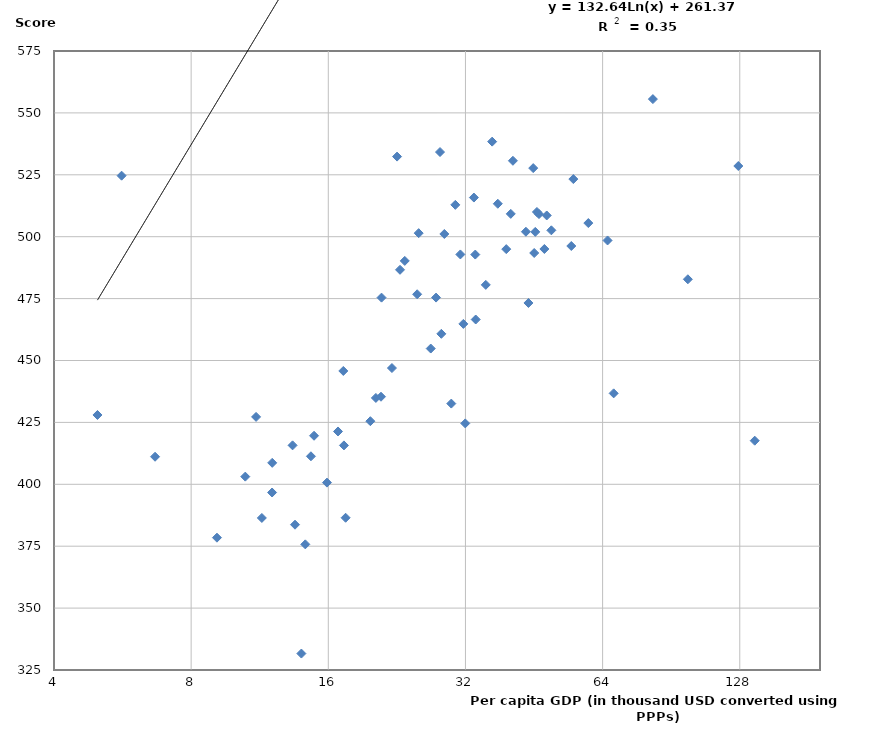
| Category | National income GPD (in thousand) |
|---|---|
| 11.10796812880865 | 427.225 |
| 14.244080743935179 | 375.745 |
| 45.92549380167015 | 509.994 |
| 47.68229980374548 | 495.037 |
| 43.43471783487115 | 502 |
| 15.8931514693368 | 400.682 |
| nan | 517.779 |
| 17.259915997248008 | 445.772 |
| nan | 475.187 |
| 45.06569154395947 | 527.705 |
| 22.07109746910648 | 446.956 |
| 22.648 | 532.347 |
| 13.35714967170521 | 415.729 |
| 14.88538947495448 | 419.608 |
| 20.93936484743499 | 475.391 |
| 29.78987192002501 | 432.596 |
| 31.18587870152681 | 492.83 |
| 45.53650585097124 | 501.937 |
| 13.964048738706149 | 331.639 |
| 28.139939440636297 | 534.194 |
| 40.6759090166703 | 530.661 |
| 39.32786767590581 | 494.978 |
| 13.5229718015613 | 383.682 |
| 6.665937217451917 | 411.132 |
| 46.40061923741901 | 509.141 |
| 26.85089388005397 | 454.829 |
| 55.19549798219206 | 523.277 |
| 25.06885185958057 | 476.748 |
| 43.99329286385754 | 473.23 |
| 10.51703284725085 | 403.1 |
| 49.39323215694124 | 502.575 |
| 33.70342504152565 | 466.553 |
| 35.46279572003777 | 480.547 |
| 36.619426171209824 | 538.395 |
| 12.05031298017294 | 408.669 |
| 33.3947999142012 | 515.81 |
| 9.113658728948902 | 378.442 |
| 23.54792569328383 | 490.225 |
| 17.46220335095807 | 386.485 |
| 27.58143225331702 | 475.409 |
| 98.45952004262756 | 482.806 |
| 127.05102897500329 | 528.55 |
| 31.66129387167069 | 464.782 |
| 17.31471824570247 | 415.71 |
| 4.98264433379983 | 427.998 |
| 14.656201657048038 | 411.314 |
| 48.25333414268663 | 508.575 |
| 37.67900778161333 | 513.304 |
| 65.61448119218723 | 498.481 |
| 12.04307118976485 | 396.684 |
| 25.26155214804288 | 501.435 |
| 28.759984291739098 | 501.1 |
| 138.05 | 417.611 |
| 20.34806959664468 | 434.885 |
| 22.9895779468672 | 486.631 |
| 82.51541175970411 | 555.575 |
| 28.32651381063207 | 460.775 |
| 30.40269360209713 | 512.864 |
| 33.62893708544898 | 492.786 |
| 45.29695626040056 | 493.422 |
| 59.53977698875046 | 505.506 |
| 16.80388227767115 | 421.337 |
| 31.96722089980793 | 424.59 |
| 11.43562810361825 | 386.403 |
| 19.787656425029628 | 425.49 |
| 67.67413447237605 | 436.731 |
| 40.23320981492114 | 509.222 |
| 54.62949516789116 | 496.242 |
| 20.88130994362741 | 435.363 |
| 5.629020506332437 | 524.645 |